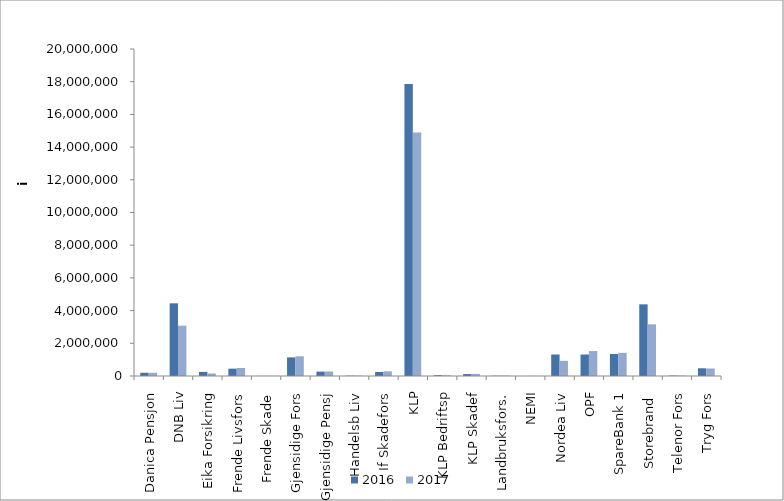
| Category | 2016 | 2017 |
|---|---|---|
| Danica Pensjon | 197548.729 | 195763.908 |
| DNB Liv | 4445756.001 | 3078142 |
| Eika Forsikring | 248926 | 154629 |
| Frende Livsfors | 449437 | 490232.783 |
| Frende Skade | 4457 | 4451 |
| Gjensidige Fors | 1139361 | 1205494 |
| Gjensidige Pensj | 268828.264 | 276379 |
| Handelsb Liv | 20615 | 19906 |
| If Skadefors | 248460.123 | 286954.019 |
| KLP | 17863744.79 | 14896769.381 |
| KLP Bedriftsp | 52817 | 42087 |
| KLP Skadef | 118032.765 | 128824.133 |
| Landbruksfors. | 17232 | 24256 |
| NEMI | 1481 | 2011 |
| Nordea Liv | 1314347.701 | 927868.645 |
| OPF | 1315437 | 1524757 |
| SpareBank 1 | 1347598.175 | 1416935.01 |
| Storebrand  | 4383879.605 | 3161034.824 |
| Telenor Fors | 25828 | 23751 |
| Tryg Fors | 472129.781 | 458748.438 |